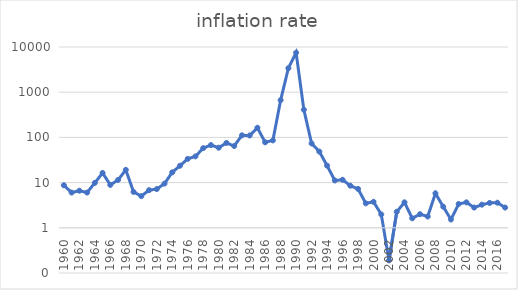
| Category | inflation rate |
|---|---|
| 1960.0 | 8.728 |
| 1961.0 | 6.02 |
| 1962.0 | 6.618 |
| 1963.0 | 6.023 |
| 1964.0 | 9.853 |
| 1965.0 | 16.363 |
| 1966.0 | 8.889 |
| 1967.0 | 11.455 |
| 1968.0 | 19.117 |
| 1969.0 | 6.231 |
| 1970.0 | 5.017 |
| 1971.0 | 6.807 |
| 1972.0 | 7.192 |
| 1973.0 | 9.513 |
| 1974.0 | 16.877 |
| 1975.0 | 23.634 |
| 1976.0 | 33.495 |
| 1977.0 | 38.042 |
| 1978.0 | 57.85 |
| 1979.0 | 67.698 |
| 1980.0 | 59.161 |
| 1981.0 | 75.418 |
| 1982.0 | 64.46 |
| 1983.0 | 111.149 |
| 1984.0 | 110.209 |
| 1985.0 | 163.398 |
| 1986.0 | 77.921 |
| 1987.0 | 85.846 |
| 1988.0 | 666.955 |
| 1989.0 | 3398.272 |
| 1990.0 | 7481.691 |
| 1991.0 | 409.528 |
| 1992.0 | 73.529 |
| 1993.0 | 48.58 |
| 1994.0 | 23.735 |
| 1995.0 | 11.131 |
| 1996.0 | 11.549 |
| 1997.0 | 8.547 |
| 1998.0 | 7.25 |
| 1999.0 | 3.47 |
| 2000.0 | 3.76 |
| 2001.0 | 1.98 |
| 2002.0 | 0.19 |
| 2003.0 | 2.26 |
| 2004.0 | 3.66 |
| 2005.0 | 1.62 |
| 2006.0 | 2.001 |
| 2007.0 | 1.779 |
| 2008.0 | 5.788 |
| 2009.0 | 2.935 |
| 2010.0 | 1.53 |
| 2011.0 | 3.37 |
| 2012.0 | 3.655 |
| 2013.0 | 2.806 |
| 2014.0 | 3.246 |
| 2015.0 | 3.548 |
| 2016.0 | 3.593 |
| 2017.0 | 2.804 |